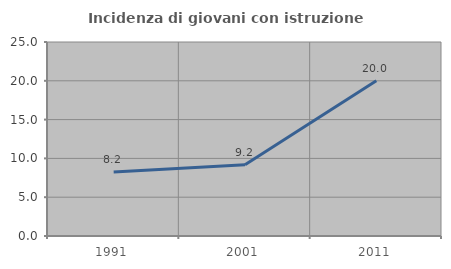
| Category | Incidenza di giovani con istruzione universitaria |
|---|---|
| 1991.0 | 8.235 |
| 2001.0 | 9.189 |
| 2011.0 | 20 |